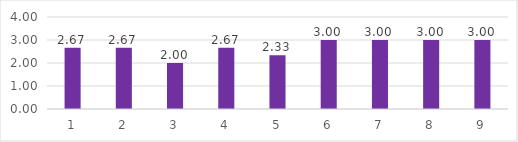
| Category | Series 0 |
|---|---|
| 0 | 2.667 |
| 1 | 2.667 |
| 2 | 2 |
| 3 | 2.667 |
| 4 | 2.333 |
| 5 | 3 |
| 6 | 3 |
| 7 | 3 |
| 8 | 3 |